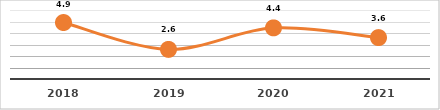
| Category | COBERTURA DE BECADOS EXTERNOS (%)
PRIMER SEMESTRE, EJERCICIO 2021 |
|---|---|
| 2018.0 | 4.91 |
| 2019.0 | 2.573 |
| 2020.0 | 4.447 |
| 2021.0 | 3.6 |